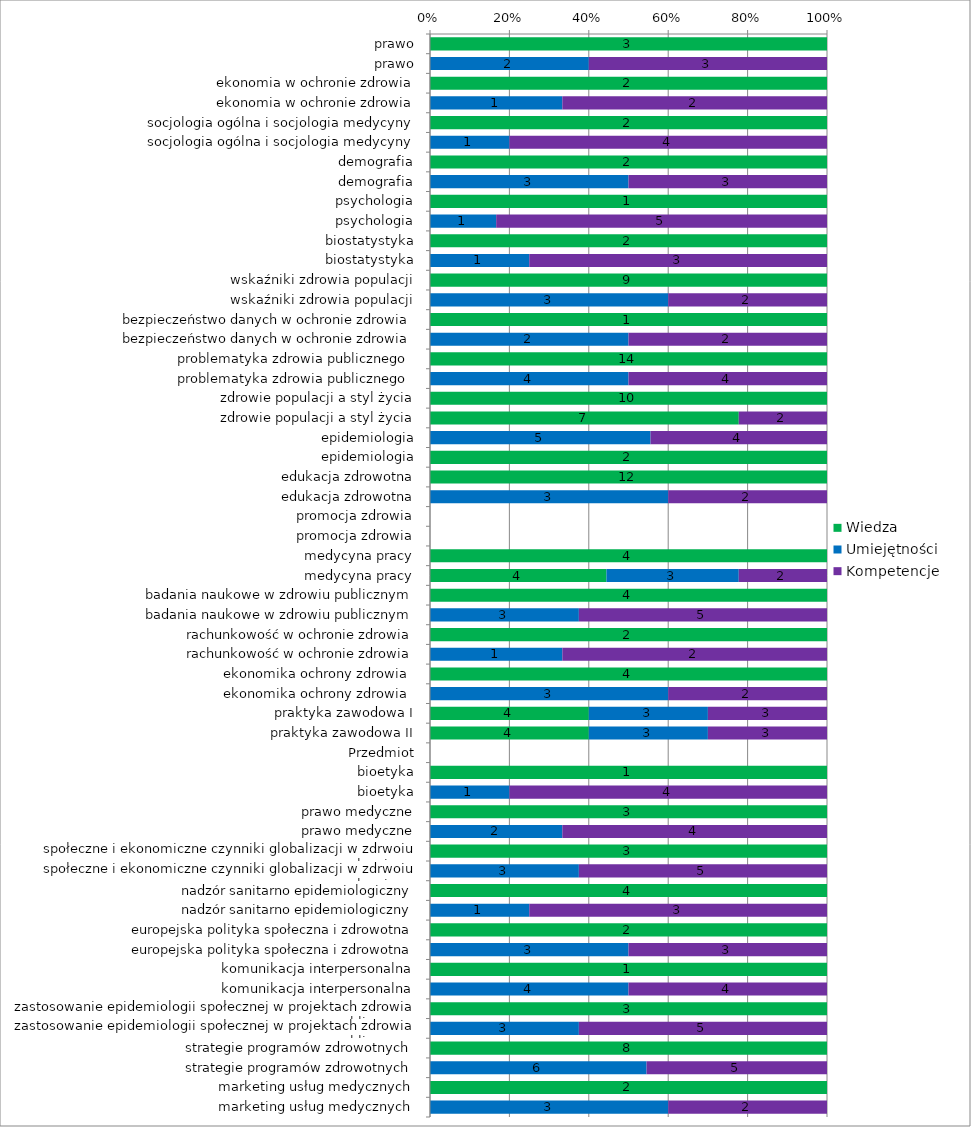
| Category | Wiedza | Umiejętności | Kompetencje |
|---|---|---|---|
|  prawo | 3 | 0 | 0 |
|  prawo | 0 | 2 | 3 |
|  ekonomia w ochronie zdrowia | 2 | 0 | 0 |
|  ekonomia w ochronie zdrowia | 0 | 1 | 2 |
|  socjologia ogólna i socjologia medycyny | 2 | 0 | 0 |
|  socjologia ogólna i socjologia medycyny | 0 | 1 | 4 |
|  demografia | 2 | 0 | 0 |
|  demografia | 0 | 3 | 3 |
|  psychologia | 1 | 0 | 0 |
|  psychologia | 0 | 1 | 5 |
|  biostatystyka | 2 | 0 | 0 |
|  biostatystyka | 0 | 1 | 3 |
| wskaźniki zdrowia populacji | 9 | 0 | 0 |
| wskaźniki zdrowia populacji | 0 | 3 | 2 |
| bezpieczeństwo danych w ochronie zdrowia | 1 | 0 | 0 |
| bezpieczeństwo danych w ochronie zdrowia | 0 | 2 | 2 |
| problematyka zdrowia publicznego  | 14 | 0 | 0 |
| problematyka zdrowia publicznego  | 0 | 4 | 4 |
| zdrowie populacji a styl życia | 10 | 0 | 0 |
| zdrowie populacji a styl życia | 7 | 0 | 2 |
| epidemiologia | 0 | 5 | 4 |
| epidemiologia | 2 | 0 | 0 |
| edukacja zdrowotna | 12 | 0 | 0 |
| edukacja zdrowotna | 0 | 3 | 2 |
| promocja zdrowia | 0 | 0 | 0 |
| promocja zdrowia | 0 | 0 | 0 |
| medycyna pracy | 4 | 0 | 0 |
| medycyna pracy | 4 | 3 | 2 |
| badania naukowe w zdrowiu publicznym | 4 | 0 | 0 |
| badania naukowe w zdrowiu publicznym | 0 | 3 | 5 |
| rachunkowość w ochronie zdrowia | 2 | 0 | 0 |
| rachunkowość w ochronie zdrowia | 0 | 1 | 2 |
| ekonomika ochrony zdrowia  | 4 | 0 | 0 |
| ekonomika ochrony zdrowia  | 0 | 3 | 2 |
| praktyka zawodowa I | 4 | 3 | 3 |
| praktyka zawodowa II | 4 | 3 | 3 |
| Przedmiot | 0 | 0 | 0 |
| bioetyka | 1 | 0 | 0 |
| bioetyka | 0 | 1 | 4 |
| prawo medyczne | 3 | 0 | 0 |
| prawo medyczne | 0 | 2 | 4 |
| społeczne i ekonomiczne czynniki globalizacji w zdrwoiu populacyjnym | 3 | 0 | 0 |
| społeczne i ekonomiczne czynniki globalizacji w zdrwoiu populacyjnym | 0 | 3 | 5 |
| nadzór sanitarno epidemiologiczny | 4 | 0 | 0 |
| nadzór sanitarno epidemiologiczny | 0 | 1 | 3 |
| europejska polityka społeczna i zdrowotna | 2 | 0 | 0 |
| europejska polityka społeczna i zdrowotna | 0 | 3 | 3 |
| komunikacja interpersonalna | 1 | 0 | 0 |
| komunikacja interpersonalna | 0 | 4 | 4 |
| zastosowanie epidemiologii społecznej w projektach zdrowia publicznego  | 3 | 0 | 0 |
| zastosowanie epidemiologii społecznej w projektach zdrowia publicznego  | 0 | 3 | 5 |
| strategie programów zdrowotnych | 8 | 0 | 0 |
| strategie programów zdrowotnych | 0 | 6 | 5 |
| marketing usług medycznych | 2 | 0 | 0 |
| marketing usług medycznych | 0 | 3 | 2 |